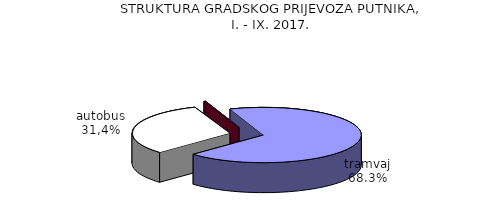
| Category | Series 0 |
|---|---|
| tramvaj | 146430 |
| autobus | 67346 |
| žičara i uspinjača | 579 |